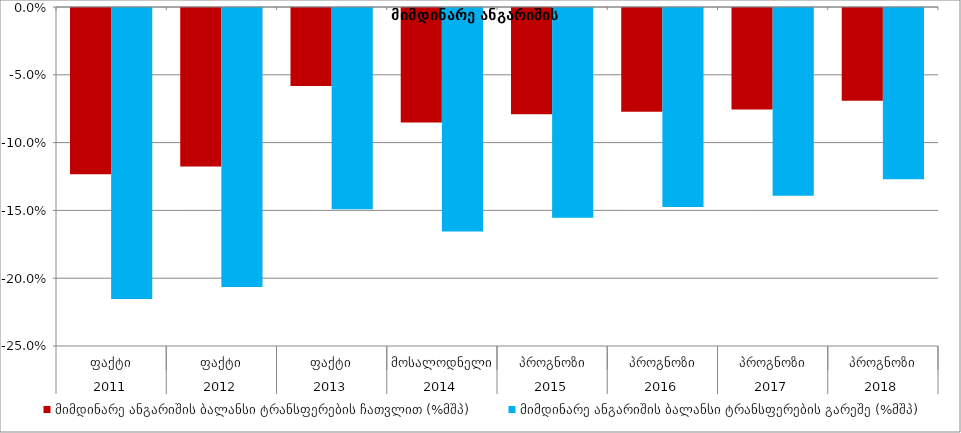
| Category | მიმდინარე ანგარიშის ბალანსი ტრანსფერების ჩათვლით (%მშპ) | მიმდინარე ანგარიშის ბალანსი ტრანსფერების გარეშე (%მშპ) |
|---|---|---|
| 0 | -0.123 | -0.215 |
| 1 | -0.117 | -0.206 |
| 2 | -0.058 | -0.148 |
| 3 | -0.084 | -0.165 |
| 4 | -0.078 | -0.155 |
| 5 | -0.077 | -0.147 |
| 6 | -0.075 | -0.139 |
| 7 | -0.068 | -0.126 |